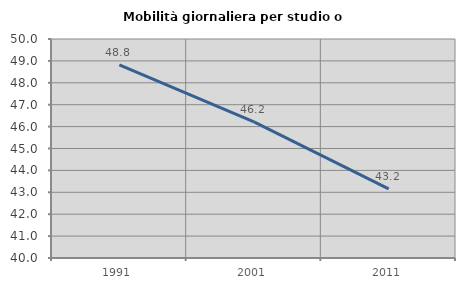
| Category | Mobilità giornaliera per studio o lavoro |
|---|---|
| 1991.0 | 48.814 |
| 2001.0 | 46.216 |
| 2011.0 | 43.159 |